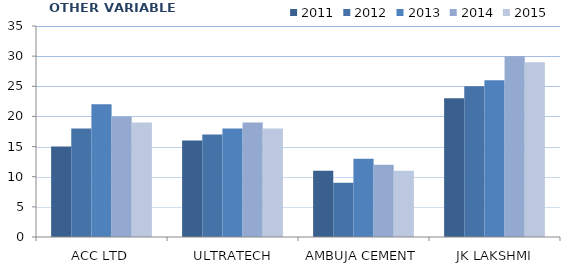
| Category | 2011 | 2012 | 2013 | 2014 | 2015 |
|---|---|---|---|---|---|
| ACC LTD | 15 | 18 | 22 | 20 | 19 |
| ULTRATECH CEMENT | 16 | 17 | 18 | 19 | 18 |
| AMBUJA CEMENT | 11 | 9 | 13 | 12 | 11 |
| JK LAKSHMI CEMENT | 23 | 25 | 26 | 30 | 29 |